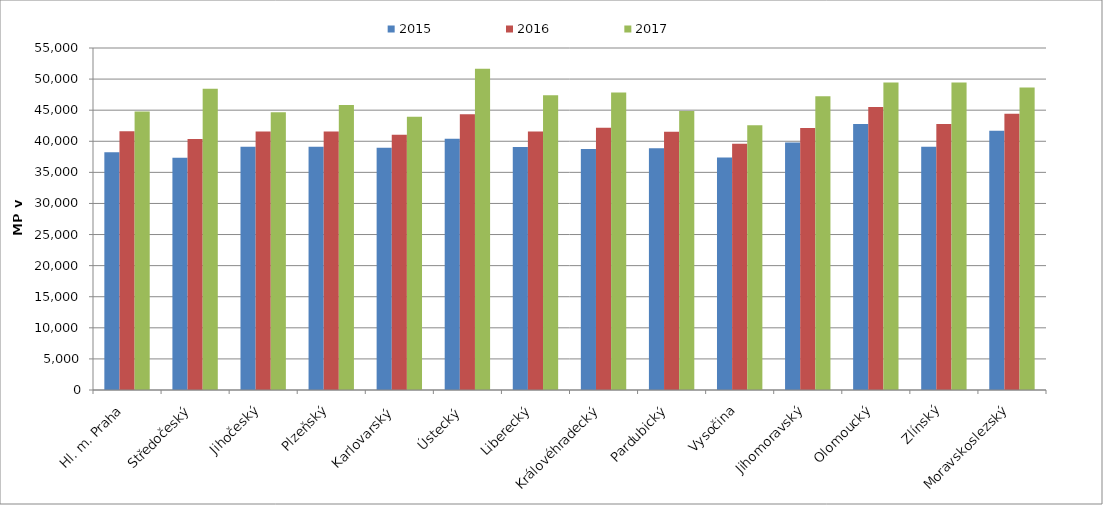
| Category | 2015 | 2016 | 2017 |
|---|---|---|---|
| Hl. m. Praha | 38232.935 | 41606.848 | 44771.128 |
| Středočeský | 37335.793 | 40359.233 | 48437.301 |
| Jihočeský | 39117.337 | 41575.252 | 44681.057 |
| Plzeňský | 39112.051 | 41571.924 | 45816.855 |
| Karlovarský  | 38963.954 | 41039.112 | 43957.367 |
| Ústecký   | 40393.589 | 44344.828 | 51679.366 |
| Liberecký | 39081.815 | 41590.2 | 47398.668 |
| Královéhradecký | 38739.056 | 42180.203 | 47862.115 |
| Pardubický | 38894.638 | 41550.065 | 44860.848 |
| Vysočina | 37393.73 | 39594.339 | 42582.707 |
| Jihomoravský | 39804.479 | 42151.576 | 47241.712 |
| Olomoucký | 42774.754 | 45523.67 | 49443.889 |
| Zlínský | 39107.992 | 42773.221 | 49437.673 |
| Moravskoslezský | 41674.388 | 44425.197 | 48628.609 |